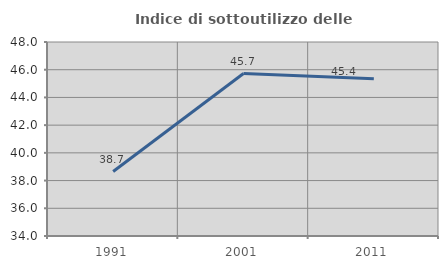
| Category | Indice di sottoutilizzo delle abitazioni  |
|---|---|
| 1991.0 | 38.65 |
| 2001.0 | 45.724 |
| 2011.0 | 45.353 |